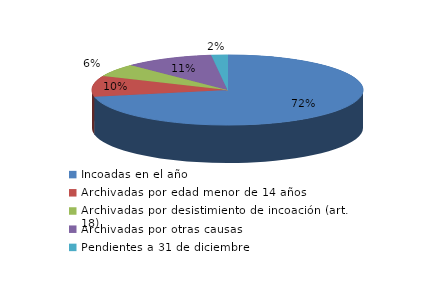
| Category | Series 0 |
|---|---|
| Incoadas en el año | 412 |
| Archivadas por edad menor de 14 años | 55 |
| Archivadas por desistimiento de incoación (art. 18) | 34 |
| Archivadas por otras causas | 61 |
| Pendientes a 31 de diciembre | 11 |